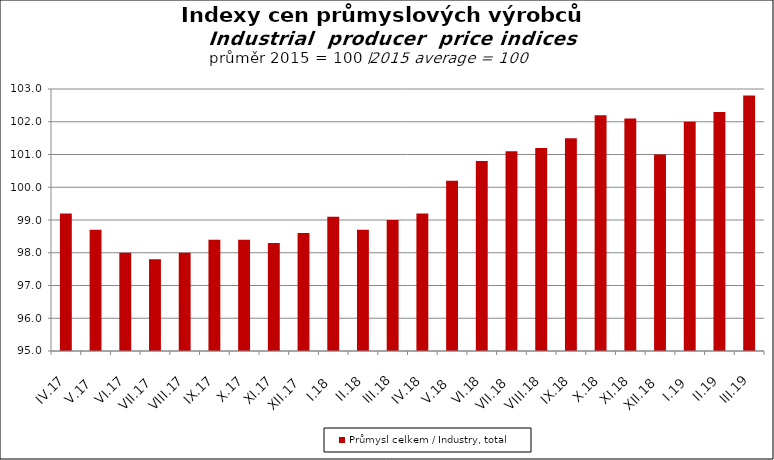
| Category | Průmysl celkem / Industry, total |
|---|---|
| IV.17 | 99.2 |
| V.17 | 98.7 |
| VI.17 | 98 |
| VII.17 | 97.8 |
| VIII.17 | 98 |
| IX.17 | 98.4 |
| X.17 | 98.4 |
| XI.17 | 98.3 |
| XII.17 | 98.6 |
| I.18 | 99.1 |
| II.18 | 98.7 |
| III.18 | 99 |
| IV.18 | 99.2 |
| V.18 | 100.2 |
| VI.18 | 100.8 |
| VII.18 | 101.1 |
| VIII.18 | 101.2 |
| IX.18 | 101.5 |
| X.18 | 102.2 |
| XI.18 | 102.1 |
| XII.18 | 101 |
| I.19 | 102 |
| II.19 | 102.3 |
| III.19 | 102.8 |